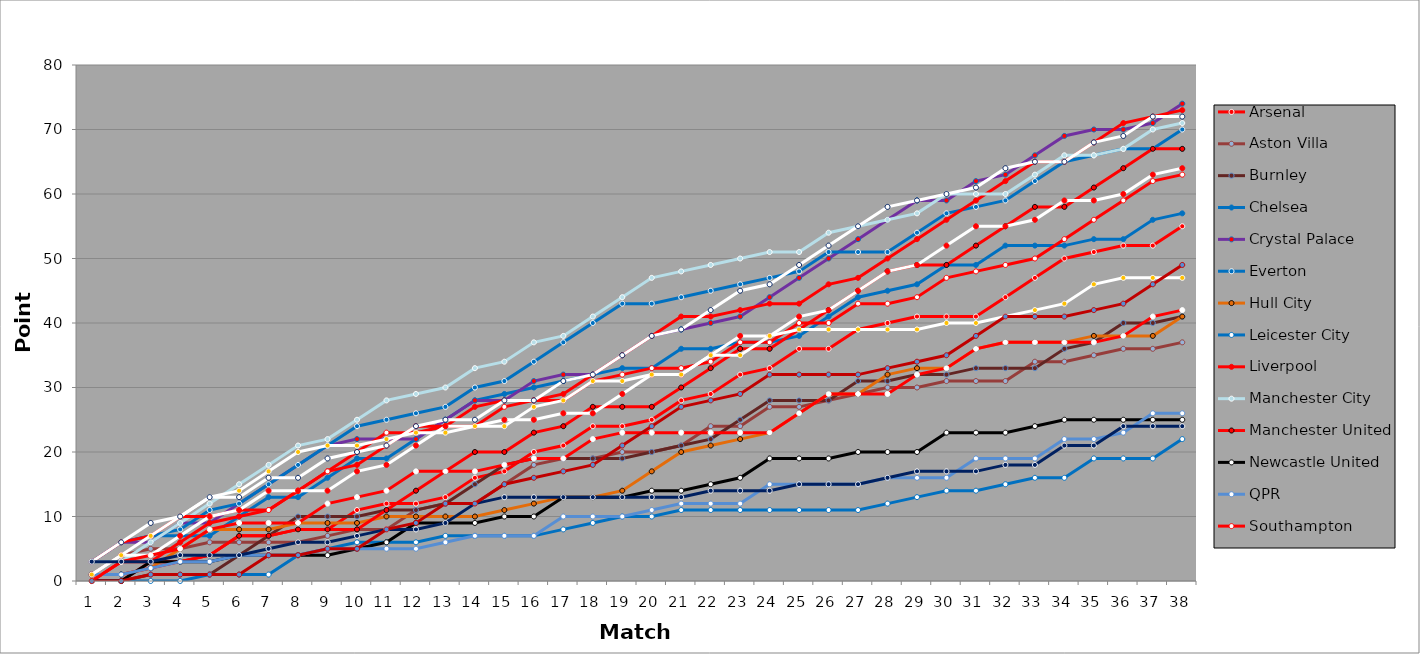
| Category | Arsenal | Aston Villa | Burnley | Chelsea | Crystal Palace | Everton | Hull City | Leicester City | Liverpool | Manchester City | Manchester United | Newcastle United | QPR | Southampton | Stoke City | Sunderland | Swansea City | Tottenham Hotspur | West Bromwich Albion | West Ham United |
|---|---|---|---|---|---|---|---|---|---|---|---|---|---|---|---|---|---|---|---|---|
| 0 | 0 | 1 | 0 | 3 | 3 | 3 | 1 | 0 | 0 | 3 | 1 | 0 | 1 | 3 | 1 | 0 | 1 | 3 | 3 | 0 |
| 1 | 0 | 4 | 0 | 6 | 6 | 6 | 1 | 0 | 3 | 3 | 1 | 0 | 1 | 6 | 4 | 3 | 4 | 6 | 3 | 0 |
| 2 | 3 | 5 | 1 | 7 | 6 | 7 | 2 | 0 | 3 | 6 | 2 | 3 | 2 | 7 | 4 | 4 | 7 | 9 | 3 | 1 |
| 3 | 3 | 5 | 1 | 7 | 9 | 8 | 5 | 0 | 6 | 9 | 3 | 3 | 3 | 10 | 7 | 5 | 10 | 10 | 4 | 1 |
| 4 | 4 | 6 | 1 | 7 | 9 | 11 | 8 | 1 | 9 | 12 | 4 | 3 | 3 | 10 | 10 | 8 | 13 | 13 | 4 | 1 |
| 5 | 7 | 6 | 4 | 10 | 12 | 12 | 8 | 1 | 10 | 15 | 7 | 4 | 4 | 11 | 11 | 9 | 14 | 13 | 4 | 1 |
| 6 | 7 | 6 | 7 | 13 | 15 | 15 | 8 | 1 | 11 | 18 | 7 | 4 | 4 | 11 | 14 | 9 | 17 | 16 | 5 | 4 |
| 7 | 8 | 6 | 10 | 13 | 18 | 18 | 9 | 4 | 14 | 21 | 8 | 4 | 4 | 14 | 14 | 9 | 20 | 16 | 6 | 4 |
| 8 | 8 | 7 | 10 | 16 | 21 | 21 | 9 | 5 | 17 | 22 | 8 | 4 | 5 | 17 | 14 | 12 | 21 | 19 | 6 | 5 |
| 9 | 11 | 8 | 10 | 19 | 22 | 24 | 9 | 6 | 18 | 25 | 8 | 5 | 5 | 20 | 17 | 13 | 21 | 20 | 7 | 5 |
| 10 | 12 | 8 | 11 | 19 | 22 | 25 | 10 | 6 | 21 | 28 | 11 | 6 | 5 | 23 | 18 | 14 | 22 | 21 | 8 | 8 |
| 11 | 12 | 11 | 11 | 22 | 22 | 26 | 10 | 6 | 24 | 29 | 14 | 9 | 5 | 23 | 21 | 17 | 23 | 24 | 8 | 9 |
| 12 | 13 | 12 | 12 | 25 | 25 | 27 | 10 | 7 | 24 | 30 | 17 | 9 | 6 | 24 | 24 | 17 | 23 | 25 | 9 | 12 |
| 13 | 16 | 12 | 15 | 28 | 28 | 30 | 10 | 7 | 27 | 33 | 20 | 9 | 7 | 24 | 24 | 17 | 24 | 25 | 12 | 12 |
| 14 | 17 | 15 | 18 | 29 | 28 | 31 | 11 | 7 | 28 | 34 | 20 | 10 | 7 | 27 | 25 | 18 | 24 | 28 | 13 | 15 |
| 15 | 20 | 18 | 19 | 30 | 31 | 34 | 12 | 7 | 28 | 37 | 23 | 10 | 7 | 28 | 25 | 19 | 27 | 28 | 13 | 16 |
| 16 | 21 | 19 | 19 | 31 | 32 | 37 | 13 | 8 | 29 | 38 | 24 | 13 | 10 | 28 | 26 | 19 | 28 | 31 | 13 | 17 |
| 17 | 24 | 19 | 19 | 32 | 32 | 40 | 13 | 9 | 32 | 41 | 27 | 13 | 10 | 31 | 26 | 22 | 31 | 32 | 13 | 18 |
| 18 | 24 | 20 | 19 | 33 | 35 | 43 | 14 | 10 | 35 | 44 | 27 | 13 | 10 | 32 | 29 | 23 | 31 | 35 | 13 | 21 |
| 19 | 25 | 20 | 20 | 33 | 38 | 43 | 17 | 10 | 38 | 47 | 27 | 14 | 11 | 33 | 32 | 23 | 32 | 38 | 13 | 24 |
| 20 | 28 | 21 | 21 | 36 | 39 | 44 | 20 | 11 | 41 | 48 | 30 | 14 | 12 | 33 | 32 | 23 | 32 | 39 | 13 | 27 |
| 21 | 29 | 24 | 22 | 36 | 40 | 45 | 21 | 11 | 41 | 49 | 33 | 15 | 12 | 34 | 35 | 23 | 35 | 42 | 14 | 28 |
| 22 | 32 | 24 | 25 | 37 | 41 | 46 | 22 | 11 | 42 | 50 | 36 | 16 | 12 | 37 | 38 | 23 | 35 | 45 | 14 | 29 |
| 23 | 33 | 27 | 28 | 37 | 44 | 47 | 23 | 11 | 43 | 51 | 36 | 19 | 15 | 37 | 38 | 23 | 38 | 46 | 14 | 32 |
| 24 | 36 | 27 | 28 | 38 | 47 | 48 | 26 | 11 | 43 | 51 | 39 | 19 | 15 | 40 | 41 | 26 | 39 | 49 | 15 | 32 |
| 25 | 36 | 28 | 28 | 41 | 50 | 51 | 29 | 11 | 46 | 54 | 42 | 19 | 15 | 40 | 42 | 29 | 39 | 52 | 15 | 32 |
| 26 | 39 | 29 | 31 | 44 | 53 | 51 | 29 | 11 | 47 | 55 | 45 | 20 | 15 | 43 | 45 | 29 | 39 | 55 | 15 | 32 |
| 27 | 40 | 30 | 31 | 45 | 56 | 51 | 32 | 12 | 50 | 56 | 48 | 20 | 16 | 43 | 48 | 29 | 39 | 58 | 16 | 33 |
| 28 | 41 | 30 | 32 | 46 | 59 | 54 | 33 | 13 | 53 | 57 | 49 | 20 | 16 | 44 | 49 | 32 | 39 | 59 | 17 | 34 |
| 29 | 41 | 31 | 32 | 49 | 59 | 57 | 33 | 14 | 56 | 60 | 49 | 23 | 16 | 47 | 52 | 33 | 40 | 60 | 17 | 35 |
| 30 | 41 | 31 | 33 | 49 | 62 | 58 | 36 | 14 | 59 | 60 | 52 | 23 | 19 | 48 | 55 | 36 | 40 | 61 | 17 | 38 |
| 31 | 44 | 31 | 33 | 52 | 63 | 59 | 37 | 15 | 62 | 60 | 55 | 23 | 19 | 49 | 55 | 37 | 41 | 64 | 18 | 41 |
| 32 | 47 | 34 | 33 | 52 | 66 | 62 | 37 | 16 | 65 | 63 | 58 | 24 | 19 | 50 | 56 | 37 | 42 | 65 | 18 | 41 |
| 33 | 50 | 34 | 36 | 52 | 69 | 65 | 37 | 16 | 65 | 66 | 58 | 25 | 22 | 53 | 59 | 37 | 43 | 65 | 21 | 41 |
| 34 | 51 | 35 | 37 | 53 | 70 | 66 | 38 | 19 | 68 | 66 | 61 | 25 | 22 | 56 | 59 | 37 | 46 | 68 | 21 | 42 |
| 35 | 52 | 36 | 40 | 53 | 70 | 67 | 38 | 19 | 71 | 67 | 64 | 25 | 23 | 59 | 60 | 38 | 47 | 69 | 24 | 43 |
| 36 | 52 | 36 | 40 | 56 | 71 | 67 | 38 | 19 | 72 | 70 | 67 | 25 | 26 | 62 | 63 | 41 | 47 | 72 | 24 | 46 |
| 37 | 55 | 37 | 41 | 57 | 74 | 70 | 41 | 22 | 73 | 71 | 67 | 25 | 26 | 63 | 64 | 42 | 47 | 72 | 24 | 49 |